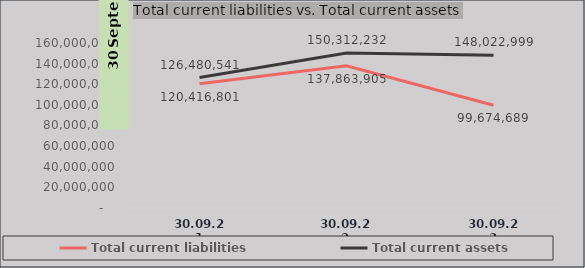
| Category | Total current liabilities | Total current assets |
|---|---|---|
| 30.09.21 | 120416800.563 | 126480540.967 |
| 30.09.22 | 137863905.482 | 150312232.415 |
| 30.09.23 | 99674689 | 148022999 |